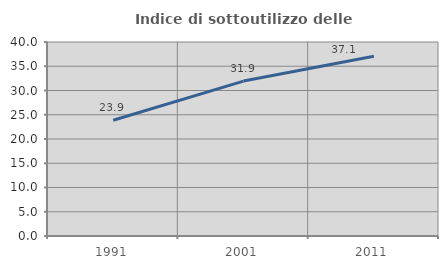
| Category | Indice di sottoutilizzo delle abitazioni  |
|---|---|
| 1991.0 | 23.871 |
| 2001.0 | 31.944 |
| 2011.0 | 37.059 |